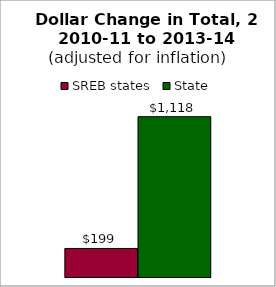
| Category | SREB states | State |
|---|---|---|
| 0 | 199.011 | 1118.371 |